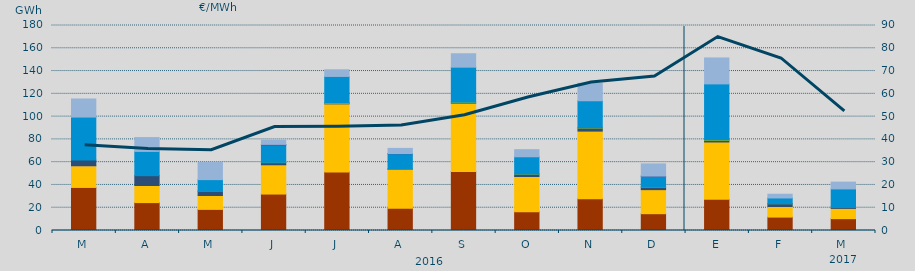
| Category | Carbón | Ciclo Combinado | Cogeneración | Consumo Bombeo | Eólica | Hidráulica | Nuclear | Turbinación bombeo |
|---|---|---|---|---|---|---|---|---|
| M | 37820.3 | 19028.5 | 23.8 | 4950.8 | 0 | 37761.8 | 0 | 15892.4 |
| A | 24502 | 15019.4 | 0 | 8611 | 0 | 21323 | 0 | 12131.8 |
| M | 18542.9 | 12194.7 | 0 | 3802.8 | 29.4 | 10110.1 | 0 | 15019.5 |
| J | 32003.2 | 25715 | 0 | 1834 | 309.7 | 15345.5 | 404.7 | 3667.5 |
| J | 51324.2 | 59857.5 | 0 | 381.3 | 830.5 | 22884.7 | 0 | 5850 |
| A | 19608 | 34074 | 0 | 154.8 | 407.6 | 13164.8 | 150 | 4538.1 |
| S | 51777.2 | 60003.2 | 0 | 418.8 | 585.4 | 30624.4 | 0 | 11791 |
| O | 16527.1 | 30870.5 | 0 | 2014.8 | 341.7 | 14982.5 | 0 | 6233.4 |
| N | 27911.6 | 59353 | 0 | 2603.5 | 562.8 | 23494.9 | 0 | 15319.9 |
| D | 14759.8 | 21112.2 | 0 | 2054.9 | 290 | 9517.7 | 60 | 10705.2 |
| E | 27333.2 | 50390.4 | 0 | 1420.1 | 796.7 | 48799.7 | 0 | 22768.5 |
| F | 11782.3 | 9297.4 | 0 | 2429.3 | 37.7 | 5011.6 | 0 | 3301.6 |
| M | 10392.3 | 9024.8 | 0 | 1213 | 83.9 | 15815.6 | 0 | 5970.4 |